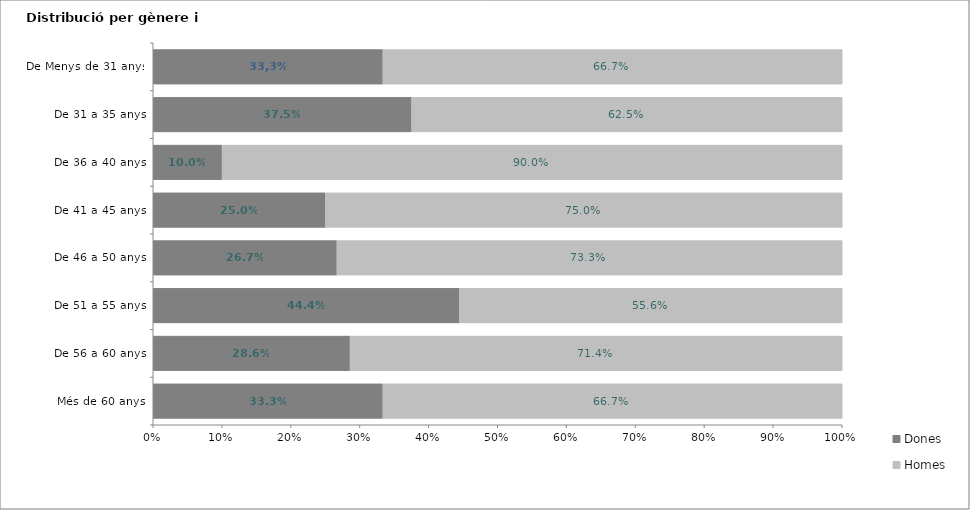
| Category | Dones | Homes |
|---|---|---|
| Més de 60 anys | 0.333 | 0.667 |
| De 56 a 60 anys | 0.286 | 0.714 |
| De 51 a 55 anys | 0.444 | 0.556 |
| De 46 a 50 anys | 0.267 | 0.733 |
| De 41 a 45 anys | 0.25 | 0.75 |
| De 36 a 40 anys | 0.1 | 0.9 |
| De 31 a 35 anys | 0.375 | 0.625 |
| De Menys de 31 anys | 0.333 | 0.667 |